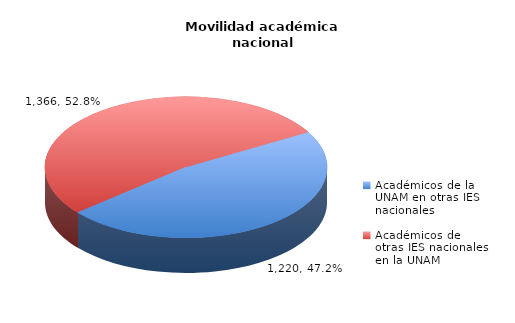
| Category | Series 0 |
|---|---|
| Académicos de la UNAM en otras IES nacionales | 1220 |
| Académicos de otras IES nacionales en la UNAM | 1366 |